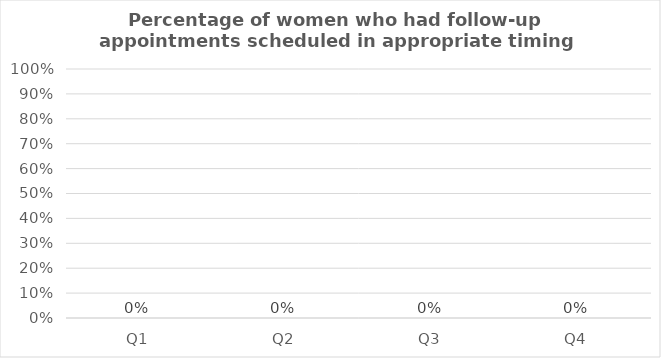
| Category | Percentage of women who had follow-up appointments scheduled in appropriate timing |
|---|---|
| Q1 | 0 |
| Q2 | 0 |
| Q3 | 0 |
| Q4 | 0 |